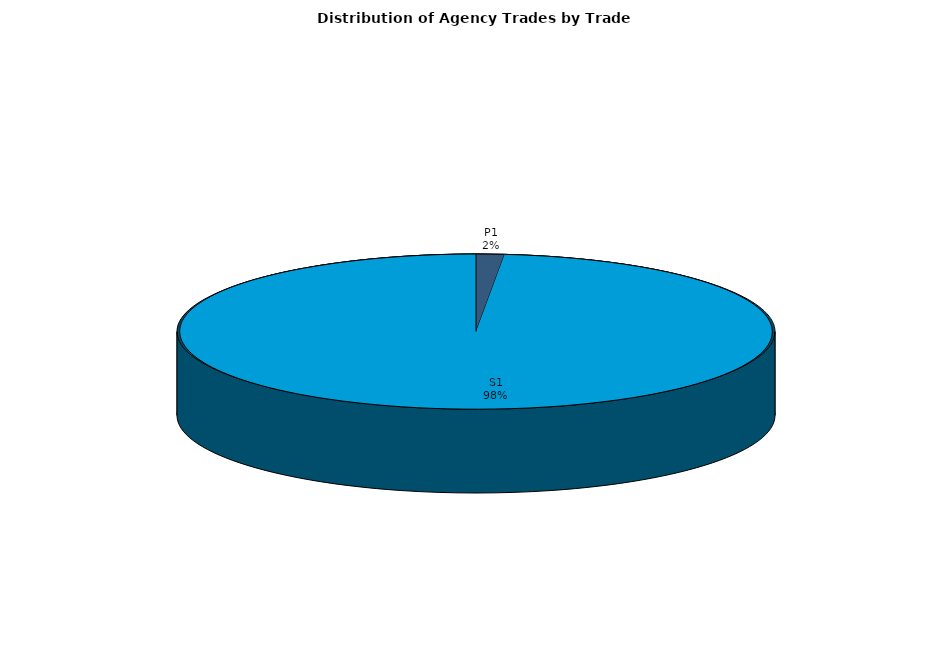
| Category | Series 0 |
|---|---|
| P1 | 30.191 |
| S1 | 1948.888 |